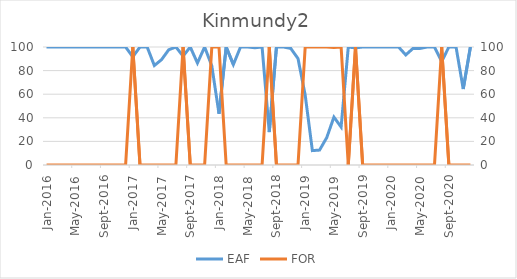
| Category | EAF |
|---|---|
| 2016-01-01 | 100 |
| 2016-02-01 | 100 |
| 2016-03-01 | 100 |
| 2016-04-01 | 100 |
| 2016-05-01 | 100 |
| 2016-06-01 | 100 |
| 2016-07-01 | 100 |
| 2016-08-01 | 100 |
| 2016-09-01 | 100 |
| 2016-10-01 | 100 |
| 2016-11-01 | 100 |
| 2016-12-01 | 100 |
| 2017-01-01 | 91.67 |
| 2017-02-01 | 100 |
| 2017-03-01 | 100 |
| 2017-04-01 | 84.31 |
| 2017-05-01 | 89.25 |
| 2017-06-01 | 97.64 |
| 2017-07-01 | 100 |
| 2017-08-01 | 92.3 |
| 2017-09-01 | 100 |
| 2017-10-01 | 86.42 |
| 2017-11-01 | 100 |
| 2017-12-01 | 84.01 |
| 2018-01-01 | 43.42 |
| 2018-02-01 | 100 |
| 2018-03-01 | 85.2 |
| 2018-04-01 | 100 |
| 2018-05-01 | 100 |
| 2018-06-01 | 99.37 |
| 2018-07-01 | 100 |
| 2018-08-01 | 27.96 |
| 2018-09-01 | 100 |
| 2018-10-01 | 100 |
| 2018-11-01 | 98.75 |
| 2018-12-01 | 90.19 |
| 2019-01-01 | 59.27 |
| 2019-02-01 | 12.2 |
| 2019-03-01 | 12.65 |
| 2019-04-01 | 23.21 |
| 2019-05-01 | 40.59 |
| 2019-06-01 | 32.2 |
| 2019-07-01 | 100 |
| 2019-08-01 | 99.2 |
| 2019-09-01 | 100 |
| 2019-10-01 | 100 |
| 2019-11-01 | 100 |
| 2019-12-01 | 100 |
| 2020-01-01 | 100 |
| 2020-02-01 | 100 |
| 2020-03-01 | 93.28 |
| 2020-04-01 | 98.75 |
| 2020-05-01 | 98.81 |
| 2020-06-01 | 100 |
| 2020-07-01 | 100 |
| 2020-08-01 | 87.67 |
| 2020-09-01 | 100 |
| 2020-10-01 | 100 |
| 2020-11-01 | 64.35 |
| 2020-12-01 | 100 |